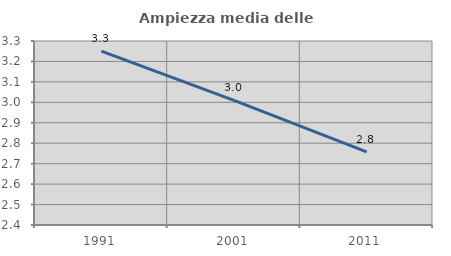
| Category | Ampiezza media delle famiglie |
|---|---|
| 1991.0 | 3.251 |
| 2001.0 | 3.009 |
| 2011.0 | 2.758 |